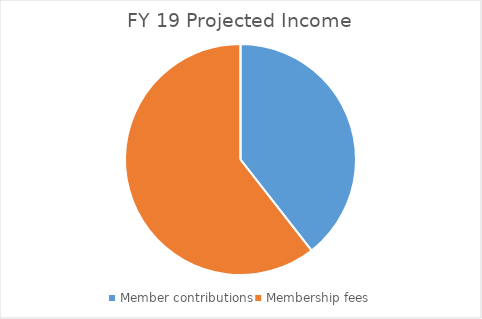
| Category | Series 0 |
|---|---|
| Member contributions | 9000 |
| Membership fees | 13818 |